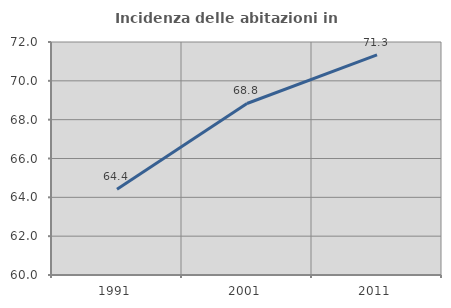
| Category | Incidenza delle abitazioni in proprietà  |
|---|---|
| 1991.0 | 64.42 |
| 2001.0 | 68.834 |
| 2011.0 | 71.334 |